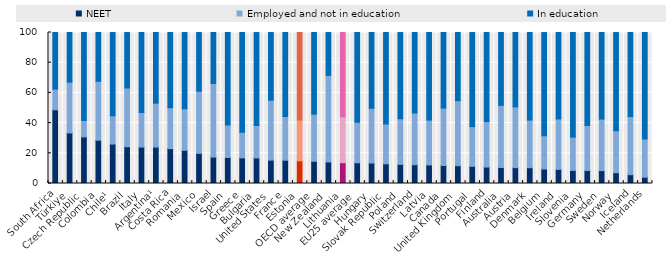
| Category | NEET | Employed and not in education | In education |
|---|---|---|---|
| South Africa | 48.798 | 13.683 | 37.519 |
| Türkiye | 33.479 | 33.624 | 32.897 |
| Czech Republic | 30.87 | 10.9 | 58.24 |
| Colombia | 28.668 | 39.035 | 32.297 |
| Chile¹ | 26.128 | 18.708 | 55.163 |
| Brazil | 24.371 | 38.85 | 36.779 |
| Italy | 24.125 | 22.916 | 52.959 |
| Argentina¹ | 24.108 | 29.077 | 46.815 |
| Costa Rica | 23.121 | 27.088 | 49.791 |
| Romania | 21.975 | 27.525 | 50.5 |
| Mexico | 19.976 | 41.151 | 38.874 |
| Israel | 17.487 | 48.721 | 33.793 |
| Spain | 17.222 | 21.56 | 61.218 |
| Greece | 16.97 | 16.951 | 66.079 |
| Bulgaria | 16.912 | 21.487 | 61.601 |
| United States | 15.479 | 39.716 | 44.806 |
| France | 15.4 | 29.002 | 55.599 |
| Estonia | 15.009 | 27.005 | 57.987 |
| OECD average | 14.721 | 31.218 | 54.24 |
| New Zealand | 14.256 | 57.369 | 28.375 |
| Lithuania | 13.765 | 30.392 | 55.842 |
| EU25 average | 13.732 | 26.86 | 59.636 |
| Hungary | 13.523 | 36.272 | 50.205 |
| Slovak Republic | 13.024 | 26.361 | 60.614 |
| Poland | 12.65 | 30.212 | 57.138 |
| Switzerland | 12.427 | 34.262 | 53.311 |
| Latvia | 12.298 | 29.696 | 58.006 |
| Canada | 11.914 | 38.039 | 50.047 |
| United Kingdom | 11.784 | 43.053 | 45.164 |
| Portugal | 11.372 | 26.264 | 62.364 |
| Finland | 10.886 | 30.127 | 58.987 |
| Australia | 10.57 | 41.19 | 48.23 |
| Austria | 10.493 | 40.255 | 49.251 |
| Denmark | 10.442 | 31.56 | 57.998 |
| Belgium | 9.637 | 21.965 | 68.398 |
| Ireland | 9.34 | 33.415 | 57.245 |
| Slovenia | 8.663 | 22.032 | 69.305 |
| Germany | 8.594 | 29.852 | 61.554 |
| Sweden | 8.536 | 34.094 | 57.369 |
| Norway | 7.127 | 27.84 | 65.033 |
| Iceland | 5.853 | 38.454 | 55.692 |
| Netherlands | 4.135 | 25.338 | 70.527 |